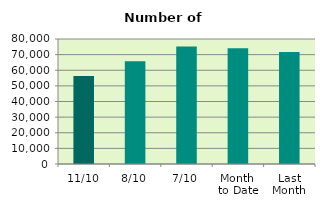
| Category | Series 0 |
|---|---|
| 11/10 | 56264 |
| 8/10 | 65772 |
| 7/10 | 75166 |
| Month 
to Date | 74121.143 |
| Last
Month | 71692 |